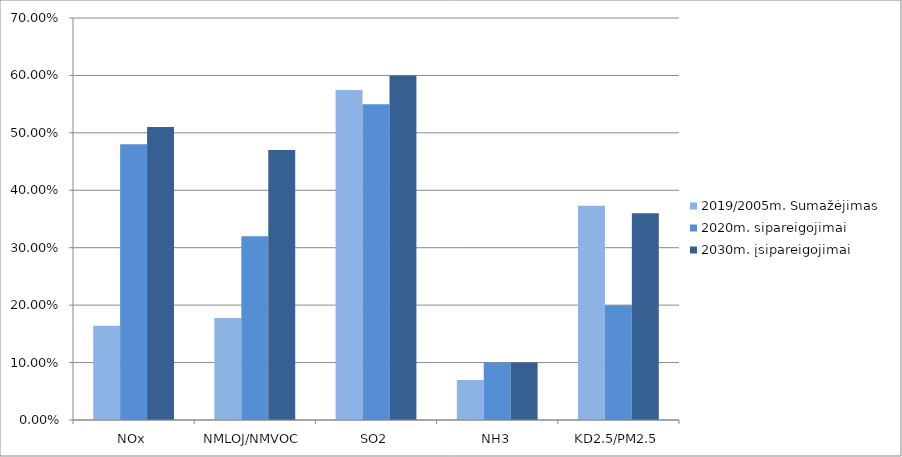
| Category | 2019/2005m. Sumažėjimas | 2020m. sipareigojimai | 2030m. įsipareigojimai |
|---|---|---|---|
| NOx | 0.164 | 0.48 | 0.51 |
| NMLOJ/NMVOC | 0.178 | 0.32 | 0.47 |
| SO2 | 0.574 | 0.55 | 0.6 |
| NH3 | 0.07 | 0.1 | 0.1 |
| KD2.5/PM2.5 | 0.373 | 0.2 | 0.36 |